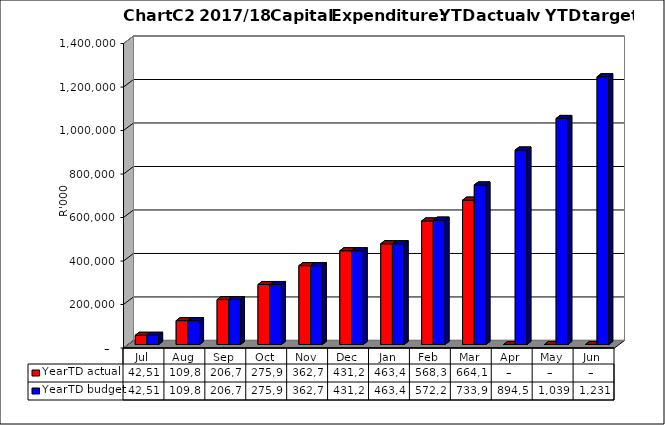
| Category | YearTD actual | YearTD budget |
|---|---|---|
| Jul | 42514077.958 | 42514077.958 |
| Aug | 109819163.669 | 109819163.669 |
| Sep | 206746264.689 | 206746264.689 |
| Oct | 275937386.544 | 275937386.544 |
| Nov | 362773276.763 | 362773276.763 |
| Dec | 431298740.768 | 431298740.768 |
| Jan | 463452466.218 | 463452466.218 |
| Feb | 568377729.453 | 572212754.825 |
| Mar | 664129376.502 | 733969291.597 |
| Apr | 0 | 894540462.807 |
| May | 0 | 1039622462.807 |
| Jun | 0 | 1231378999.579 |